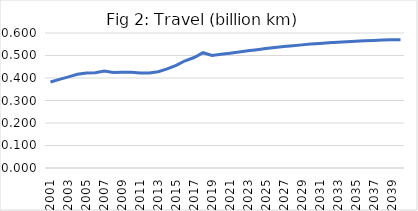
| Category | Q |
|---|---|
| 2001.0 | 0.382 |
| 2002.0 | 0.394 |
| 2003.0 | 0.405 |
| 2004.0 | 0.417 |
| 2005.0 | 0.423 |
| 2006.0 | 0.424 |
| 2007.0 | 0.431 |
| 2008.0 | 0.425 |
| 2009.0 | 0.426 |
| 2010.0 | 0.426 |
| 2011.0 | 0.422 |
| 2012.0 | 0.422 |
| 2013.0 | 0.428 |
| 2014.0 | 0.44 |
| 2015.0 | 0.456 |
| 2016.0 | 0.477 |
| 2017.0 | 0.491 |
| 2018.0 | 0.512 |
| 2019.0 | 0.5 |
| 2020.0 | 0.505 |
| 2021.0 | 0.51 |
| 2022.0 | 0.516 |
| 2023.0 | 0.521 |
| 2024.0 | 0.526 |
| 2025.0 | 0.531 |
| 2026.0 | 0.535 |
| 2027.0 | 0.54 |
| 2028.0 | 0.544 |
| 2029.0 | 0.547 |
| 2030.0 | 0.551 |
| 2031.0 | 0.554 |
| 2032.0 | 0.557 |
| 2033.0 | 0.559 |
| 2034.0 | 0.562 |
| 2035.0 | 0.564 |
| 2036.0 | 0.566 |
| 2037.0 | 0.567 |
| 2038.0 | 0.568 |
| 2039.0 | 0.57 |
| 2040.0 | 0.571 |